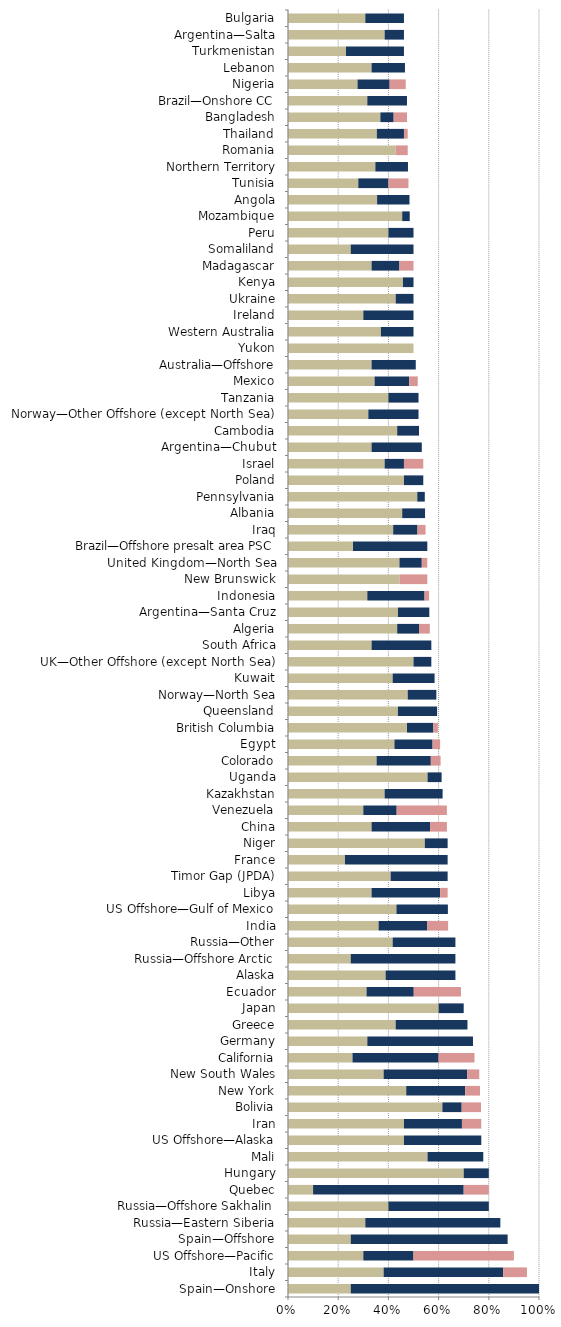
| Category |   Mild deterrent to investment |   Strong deterrent to investment |   Would not pursue investment due to this factor |
|---|---|---|---|
| Spain—Onshore | 0.25 | 0.75 | 0 |
| Italy | 0.381 | 0.476 | 0.095 |
| US Offshore—Pacific | 0.3 | 0.2 | 0.4 |
| Spain—Offshore | 0.25 | 0.625 | 0 |
| Russia—Eastern Siberia | 0.308 | 0.538 | 0 |
| Russia—Offshore Sakhalin | 0.4 | 0.4 | 0 |
| Quebec | 0.1 | 0.6 | 0.1 |
| Hungary | 0.7 | 0.1 | 0 |
| Mali | 0.556 | 0.222 | 0 |
| US Offshore—Alaska | 0.462 | 0.308 | 0 |
| Iran | 0.462 | 0.231 | 0.077 |
| Bolivia | 0.615 | 0.077 | 0.077 |
| New York | 0.471 | 0.235 | 0.059 |
| New South Wales | 0.381 | 0.333 | 0.048 |
| California | 0.257 | 0.343 | 0.143 |
| Germany | 0.316 | 0.421 | 0 |
| Greece | 0.429 | 0.286 | 0 |
| Japan | 0.6 | 0.1 | 0 |
| Ecuador | 0.313 | 0.188 | 0.188 |
| Alaska | 0.389 | 0.278 | 0 |
| Russia—Offshore Arctic | 0.25 | 0.417 | 0 |
| Russia—Other | 0.417 | 0.25 | 0 |
| India | 0.361 | 0.194 | 0.083 |
| US Offshore—Gulf of Mexico | 0.432 | 0.205 | 0 |
| Libya | 0.333 | 0.273 | 0.03 |
| Timor Gap (JPDA) | 0.409 | 0.227 | 0 |
| France | 0.227 | 0.409 | 0 |
| Niger | 0.545 | 0.091 | 0 |
| China | 0.333 | 0.233 | 0.067 |
| Venezuela | 0.3 | 0.133 | 0.2 |
| Kazakhstan | 0.385 | 0.231 | 0 |
| Uganda | 0.556 | 0.056 | 0 |
| Colorado | 0.353 | 0.216 | 0.039 |
| Egypt | 0.424 | 0.152 | 0.03 |
| British Columbia | 0.474 | 0.105 | 0.018 |
| Queensland | 0.438 | 0.156 | 0 |
| Norway—North Sea | 0.477 | 0.114 | 0 |
| Kuwait | 0.417 | 0.167 | 0 |
| UK—Other Offshore (except North Sea) | 0.5 | 0.071 | 0 |
| South Africa | 0.333 | 0.238 | 0 |
| Algeria | 0.435 | 0.087 | 0.043 |
| Argentina—Santa Cruz | 0.438 | 0.125 | 0 |
| Indonesia | 0.316 | 0.228 | 0.018 |
| New Brunswick | 0.444 | 0 | 0.111 |
| United Kingdom—North Sea | 0.444 | 0.089 | 0.022 |
| Brazil—Offshore presalt area PSC | 0.259 | 0.296 | 0 |
| Iraq | 0.419 | 0.097 | 0.032 |
| Albania | 0.455 | 0.091 | 0 |
| Pennsylvania | 0.515 | 0.03 | 0 |
| Poland | 0.462 | 0.077 | 0 |
| Israel | 0.385 | 0.077 | 0.077 |
| Argentina—Chubut | 0.333 | 0.2 | 0 |
| Cambodia | 0.435 | 0.087 | 0 |
| Norway—Other Offshore (except North Sea) | 0.32 | 0.2 | 0 |
| Tanzania | 0.4 | 0.12 | 0 |
| Mexico | 0.345 | 0.138 | 0.034 |
| Australia—Offshore | 0.333 | 0.176 | 0 |
| Yukon | 0.5 | 0 | 0 |
| Western Australia | 0.37 | 0.13 | 0 |
| Ireland | 0.3 | 0.2 | 0 |
| Ukraine | 0.429 | 0.071 | 0 |
| Kenya | 0.458 | 0.042 | 0 |
| Madagascar | 0.333 | 0.111 | 0.056 |
| Somaliland | 0.25 | 0.25 | 0 |
| Peru | 0.4 | 0.1 | 0 |
| Mozambique | 0.455 | 0.03 | 0 |
| Angola | 0.355 | 0.129 | 0 |
| Tunisia | 0.28 | 0.12 | 0.08 |
| Northern Territory | 0.348 | 0.13 | 0 |
| Romania | 0.429 | 0 | 0.048 |
| Thailand | 0.354 | 0.108 | 0.015 |
| Bangladesh | 0.368 | 0.053 | 0.053 |
| Brazil—Onshore CC | 0.316 | 0.158 | 0 |
| Nigeria | 0.277 | 0.128 | 0.064 |
| Lebanon | 0.333 | 0.133 | 0 |
| Turkmenistan | 0.231 | 0.231 | 0 |
| Argentina—Salta | 0.385 | 0.077 | 0 |
| Bulgaria | 0.308 | 0.154 | 0 |